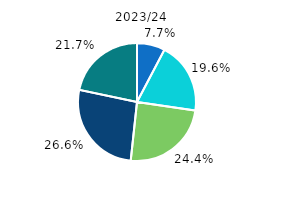
| Category | 2023/24 |
|---|---|
| sub 30 ani | 7.7 |
| 30-39 ani | 19.6 |
| 40-49 ani | 24.4 |
| 50-59 ani | 26.6 |
| 60 ani şi 
peste | 21.7 |